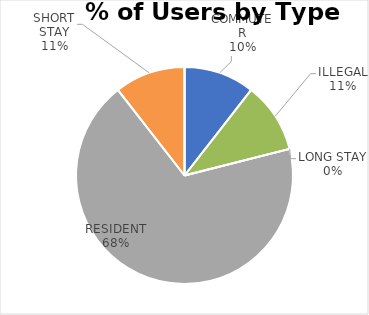
| Category | REYNOLDS PLACE |
|---|---|
| COMMUTER | 2 |
| ILLEGAL | 2 |
| LONG STAY | 0 |
| RESIDENT | 13 |
| SHORT STAY | 2 |
| DISABLED | 0 |
| OTHER | 0 |